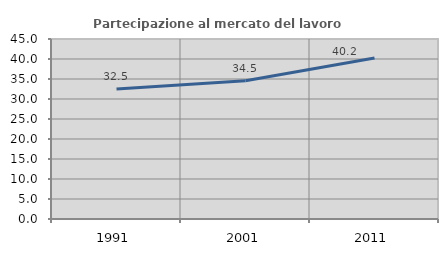
| Category | Partecipazione al mercato del lavoro  femminile |
|---|---|
| 1991.0 | 32.485 |
| 2001.0 | 34.54 |
| 2011.0 | 40.229 |